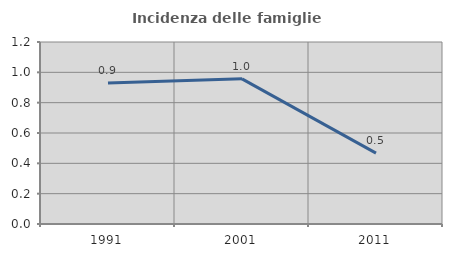
| Category | Incidenza delle famiglie numerose |
|---|---|
| 1991.0 | 0.93 |
| 2001.0 | 0.957 |
| 2011.0 | 0.467 |